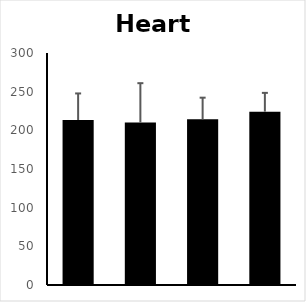
| Category | HR |
|---|---|
| 0 | 213.374 |
| 1 | 210.133 |
| 2 | 214.212 |
| 3 | 224.135 |